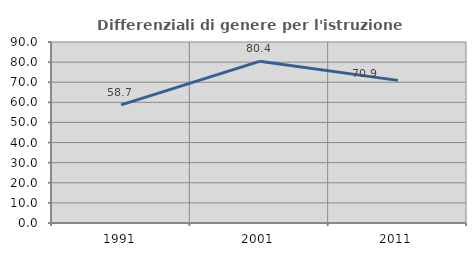
| Category | Differenziali di genere per l'istruzione superiore |
|---|---|
| 1991.0 | 58.719 |
| 2001.0 | 80.384 |
| 2011.0 | 70.925 |